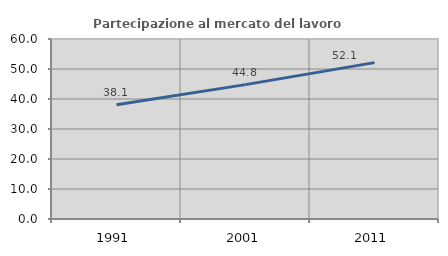
| Category | Partecipazione al mercato del lavoro  femminile |
|---|---|
| 1991.0 | 38.087 |
| 2001.0 | 44.793 |
| 2011.0 | 52.129 |